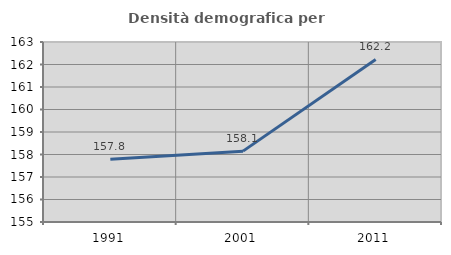
| Category | Densità demografica |
|---|---|
| 1991.0 | 157.787 |
| 2001.0 | 158.149 |
| 2011.0 | 162.225 |